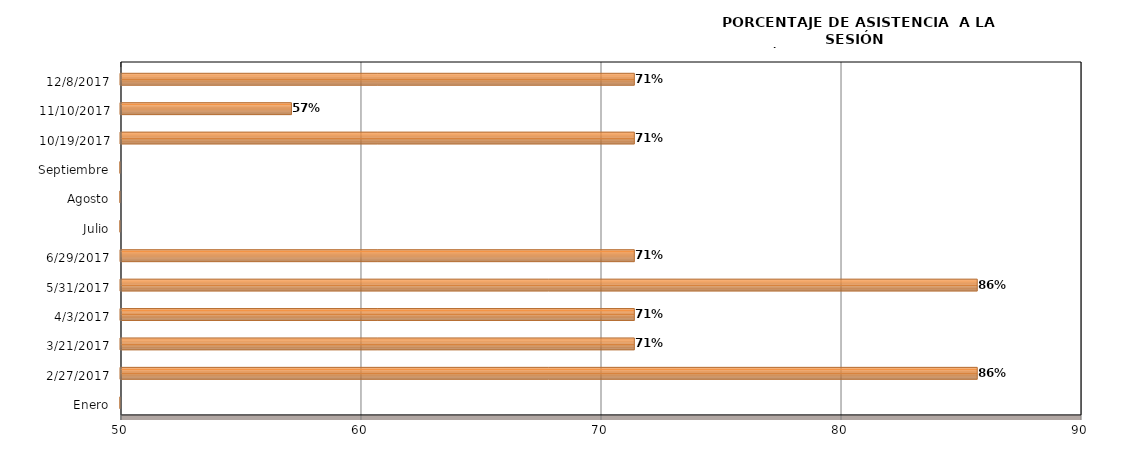
| Category | Series 0 |
|---|---|
| Enero | 0 |
| 27/02/2017 | 85.714 |
| 21/03/2017 | 71.429 |
| 03/04/2017 | 71.429 |
| 31/05/2017 | 85.714 |
| 29/06/2017 | 71.429 |
| Julio | 0 |
| Agosto | 0 |
| Septiembre | 0 |
| 19/10/2017 | 71.429 |
| 10/11/2017 | 57.143 |
| 08/12/2017 | 71.429 |